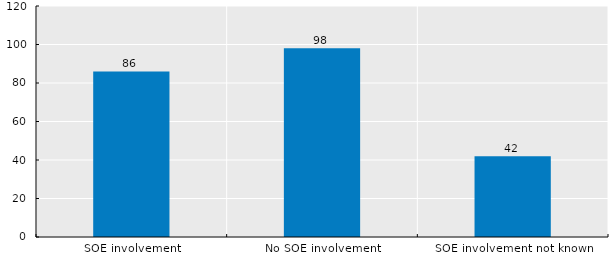
| Category | Out of 226 sanctioned  bribery transactions, where bribe recipients were in economies participating in the BRI |
|---|---|
| SOE involvement | 86 |
| No SOE involvement | 98 |
| SOE involvement not known | 42 |